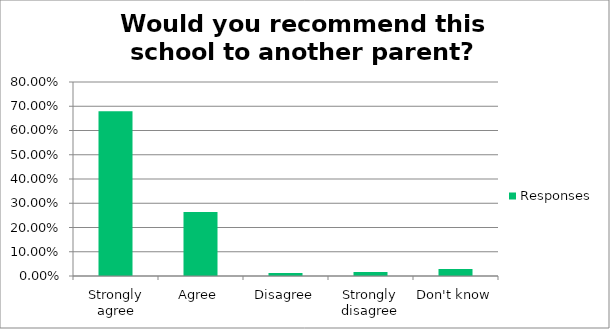
| Category | Responses |
|---|---|
| Strongly agree | 0.679 |
| Agree | 0.264 |
| Disagree | 0.012 |
| Strongly disagree | 0.016 |
| Don't know | 0.028 |